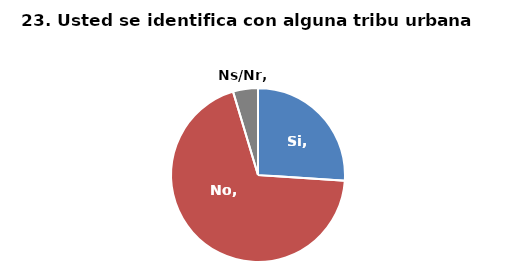
| Category | Series 0 |
|---|---|
| Si | 0.262 |
| No | 0.698 |
| Ns/Nr | 0.047 |